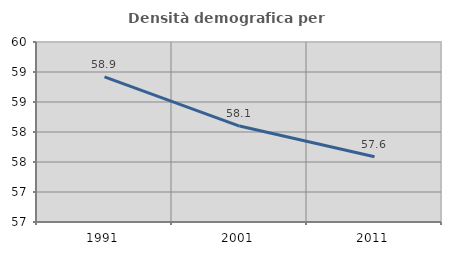
| Category | Densità demografica |
|---|---|
| 1991.0 | 58.92 |
| 2001.0 | 58.099 |
| 2011.0 | 57.587 |